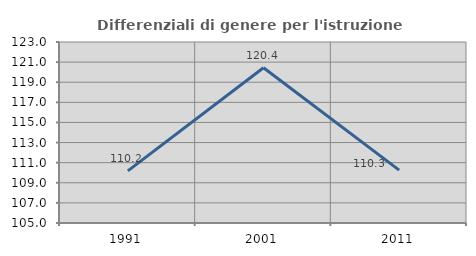
| Category | Differenziali di genere per l'istruzione superiore |
|---|---|
| 1991.0 | 110.181 |
| 2001.0 | 120.446 |
| 2011.0 | 110.261 |